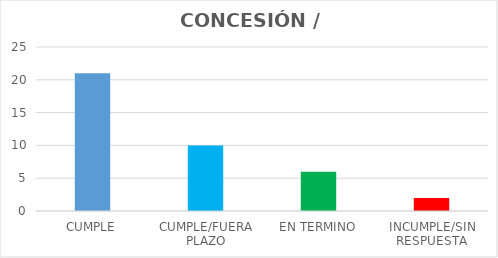
| Category | TOTAL |
|---|---|
| CUMPLE | 21 |
| CUMPLE/FUERA PLAZO | 10 |
| EN TERMINO | 6 |
| INCUMPLE/SIN RESPUESTA | 2 |